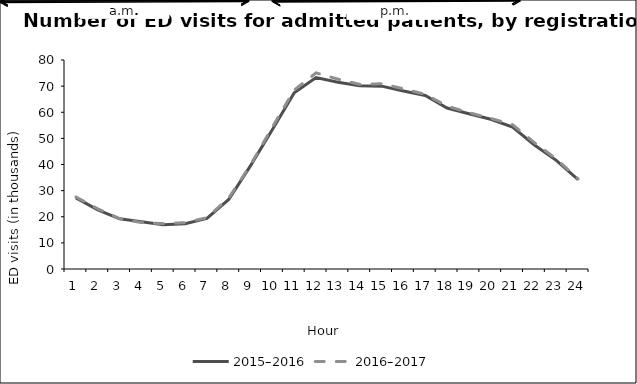
| Category | 2015–2016 | 2016–2017 |
|---|---|---|
| 1.0 | 27.222 | 27.568 |
| 2.0 | 22.619 | 23.032 |
| 3.0 | 19.201 | 19.297 |
| 4.0 | 18.114 | 17.768 |
| 5.0 | 16.96 | 17.361 |
| 6.0 | 17.363 | 17.742 |
| 7.0 | 19.334 | 19.641 |
| 8.0 | 26.613 | 27.175 |
| 9.0 | 39.582 | 39.857 |
| 10.0 | 53.383 | 54.344 |
| 11.0 | 67.47 | 68.494 |
| 12.0 | 73.27 | 75.068 |
| 13.0 | 71.49 | 72.675 |
| 14.0 | 70.13 | 70.67 |
| 15.0 | 69.997 | 70.915 |
| 16.0 | 68.11 | 68.993 |
| 17.0 | 66.401 | 66.837 |
| 18.0 | 61.618 | 62.356 |
| 19.0 | 59.44 | 59.856 |
| 20.0 | 57.307 | 57.642 |
| 21.0 | 54.325 | 55.246 |
| 22.0 | 47.454 | 48.362 |
| 23.0 | 41.585 | 42.149 |
| 24.0 | 34.255 | 34.49 |